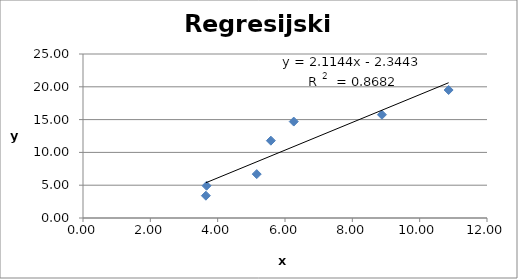
| Category | Series 0 |
|---|---|
| 3.65 | 3.4 |
| 3.67 | 4.92 |
| 5.16 | 6.69 |
| 5.58 | 11.79 |
| 6.26 | 14.7 |
| 8.88 | 15.74 |
| 10.86 | 19.51 |